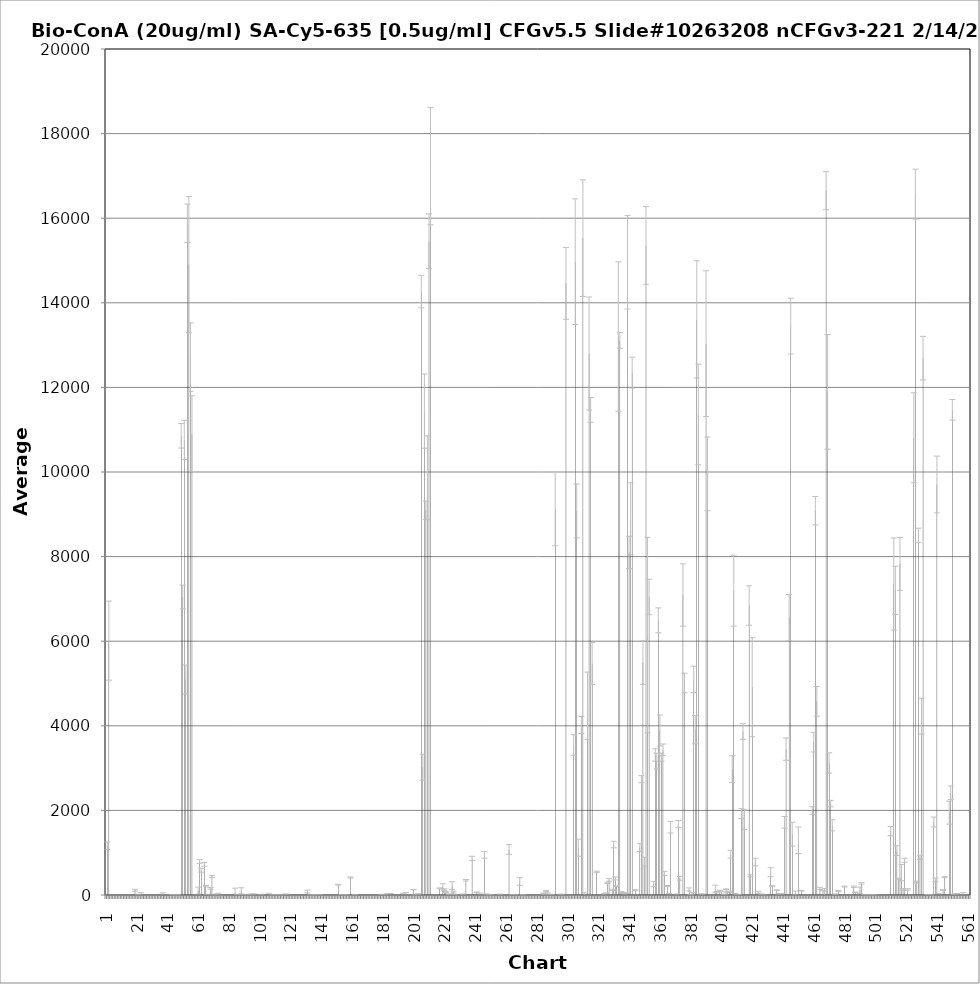
| Category | Average RFU |
|---|---|
| 1.0 | -9.25 |
| 2.0 | 1165 |
| 3.0 | 6013 |
| 4.0 | -28.25 |
| 5.0 | -6 |
| 6.0 | -19.5 |
| 7.0 | -5.5 |
| 8.0 | -15.75 |
| 9.0 | -4.5 |
| 10.0 | -16.5 |
| 11.0 | -10.25 |
| 12.0 | -10 |
| 13.0 | -50.75 |
| 14.0 | -29.5 |
| 15.0 | -39.5 |
| 16.0 | -67.5 |
| 17.0 | -46.5 |
| 18.0 | -33.5 |
| 19.0 | -15.5 |
| 20.0 | 110.25 |
| 21.0 | -17.25 |
| 22.0 | -3.5 |
| 23.0 | -33.5 |
| 24.0 | 20.75 |
| 25.0 | -8.75 |
| 26.0 | -29 |
| 27.0 | -6 |
| 28.0 | -24 |
| 29.0 | -8.5 |
| 30.0 | -19.75 |
| 31.0 | -7 |
| 32.0 | -10.25 |
| 33.0 | -9.75 |
| 34.0 | -10 |
| 35.0 | -9 |
| 36.0 | -11 |
| 37.0 | -46.5 |
| 38.0 | 4.75 |
| 39.0 | -52.25 |
| 40.0 | -44.25 |
| 41.0 | -39.75 |
| 42.0 | -19.5 |
| 43.0 | -25 |
| 44.0 | 0 |
| 45.0 | -19.25 |
| 46.0 | 3.75 |
| 47.0 | -22.25 |
| 48.0 | -0.5 |
| 49.0 | -12 |
| 50.0 | 10856 |
| 51.0 | 7046.75 |
| 52.0 | 10758.75 |
| 53.0 | 5094.25 |
| 54.0 | 15881 |
| 55.0 | 14902.5 |
| 56.0 | 12715 |
| 57.0 | 10904 |
| 58.0 | -3.5 |
| 59.0 | -9.25 |
| 60.0 | -47.25 |
| 61.0 | 103.75 |
| 62.0 | 793.25 |
| 63.0 | 584.25 |
| 64.0 | -22.5 |
| 65.0 | 724.5 |
| 66.0 | 210 |
| 67.0 | 14.5 |
| 68.0 | -22.75 |
| 69.0 | 157.25 |
| 70.0 | 438.25 |
| 71.0 | 2.75 |
| 72.0 | 9.75 |
| 73.0 | -19 |
| 74.0 | 19.75 |
| 75.0 | -17.5 |
| 76.0 | -7 |
| 77.0 | -16 |
| 78.0 | -8.75 |
| 79.0 | -17 |
| 80.0 | -14 |
| 81.0 | -11 |
| 82.0 | -4.75 |
| 83.0 | -3.25 |
| 84.0 | -79.25 |
| 85.0 | 59.25 |
| 86.0 | -39.5 |
| 87.0 | 10.75 |
| 88.0 | 1.25 |
| 89.0 | 98.25 |
| 90.0 | -26.75 |
| 91.0 | 10.75 |
| 92.0 | -25.75 |
| 93.0 | 5 |
| 94.0 | -16.75 |
| 95.0 | 14.75 |
| 96.0 | -3.25 |
| 97.0 | 24.25 |
| 98.0 | -7 |
| 99.0 | -10.5 |
| 100.0 | -17 |
| 101.0 | -39.5 |
| 102.0 | 15.25 |
| 103.0 | -20.25 |
| 104.0 | -6 |
| 105.0 | -17.5 |
| 106.0 | -6.75 |
| 107.0 | 20 |
| 108.0 | -14 |
| 109.0 | -2.5 |
| 110.0 | -14.75 |
| 111.0 | -121.5 |
| 112.0 | 7.5 |
| 113.0 | -10.5 |
| 114.0 | 8.75 |
| 115.0 | -36 |
| 116.0 | 8.5 |
| 117.0 | -28.75 |
| 118.0 | 19.5 |
| 119.0 | -9.75 |
| 120.0 | -5.5 |
| 121.0 | -6.75 |
| 122.0 | -5 |
| 123.0 | -21.75 |
| 124.0 | -59.5 |
| 125.0 | -17.75 |
| 126.0 | -30.5 |
| 127.0 | -7 |
| 128.0 | -20.75 |
| 129.0 | -9 |
| 130.0 | -19.5 |
| 131.0 | -12.5 |
| 132.0 | 81.5 |
| 133.0 | -13.5 |
| 134.0 | 1.5 |
| 135.0 | -7.5 |
| 136.0 | 3.25 |
| 137.0 | -44 |
| 138.0 | 7 |
| 139.0 | -29.25 |
| 140.0 | 2.5 |
| 141.0 | -14.75 |
| 142.0 | -5.25 |
| 143.0 | -9.25 |
| 144.0 | -6 |
| 145.0 | -10 |
| 146.0 | -22.5 |
| 147.0 | -7.25 |
| 148.0 | -27.75 |
| 149.0 | -7.25 |
| 150.0 | -16.75 |
| 151.0 | -3.5 |
| 152.0 | 243.5 |
| 153.0 | -10 |
| 154.0 | -3 |
| 155.0 | -18 |
| 156.0 | -51.5 |
| 157.0 | -26 |
| 158.0 | -35.25 |
| 159.0 | -37.25 |
| 160.0 | 413.25 |
| 161.0 | -21 |
| 162.0 | -14 |
| 163.0 | -10 |
| 164.0 | -12.25 |
| 165.0 | -7.5 |
| 166.0 | -6.75 |
| 167.0 | -6.75 |
| 168.0 | -9.25 |
| 169.0 | -24.25 |
| 170.0 | -6 |
| 171.0 | -19.5 |
| 172.0 | -6.25 |
| 173.0 | -14.75 |
| 174.0 | -4.75 |
| 175.0 | -12.5 |
| 176.0 | -15.5 |
| 177.0 | -5 |
| 178.0 | -18 |
| 179.0 | -30.75 |
| 180.0 | -11 |
| 181.0 | -31.75 |
| 182.0 | -26.75 |
| 183.0 | -29 |
| 184.0 | 2.5 |
| 185.0 | -31 |
| 186.0 | 12.5 |
| 187.0 | -25.75 |
| 188.0 | -9.5 |
| 189.0 | -5 |
| 190.0 | -9 |
| 191.0 | -8 |
| 192.0 | -8 |
| 193.0 | -10.75 |
| 194.0 | 14.25 |
| 195.0 | -7.75 |
| 196.0 | 18.25 |
| 197.0 | -7.5 |
| 198.0 | -21.75 |
| 199.0 | -16.75 |
| 200.0 | -25.75 |
| 201.0 | 128 |
| 202.0 | -3.75 |
| 203.0 | -9.75 |
| 204.0 | 23 |
| 205.0 | -14 |
| 206.0 | 14266 |
| 207.0 | 3019.5 |
| 208.0 | 11439 |
| 209.0 | 9096.5 |
| 210.0 | 9862.25 |
| 211.0 | 15454.75 |
| 212.0 | 17232 |
| 213.0 | -10.5 |
| 214.0 | -10.25 |
| 215.0 | -14.5 |
| 216.0 | -30.25 |
| 217.0 | -7.75 |
| 218.0 | 156.5 |
| 219.0 | -26.75 |
| 220.0 | 205.25 |
| 221.0 | 125 |
| 222.0 | 67.5 |
| 223.0 | -14.25 |
| 224.0 | 14 |
| 225.0 | -22.25 |
| 226.0 | 219.75 |
| 227.0 | 69 |
| 228.0 | 6.5 |
| 229.0 | -8 |
| 230.0 | -11.5 |
| 231.0 | -10 |
| 232.0 | -10.75 |
| 233.0 | 19 |
| 234.0 | -6.25 |
| 235.0 | 346.75 |
| 236.0 | -10.5 |
| 237.0 | -21.5 |
| 238.0 | -33.25 |
| 239.0 | 863.75 |
| 240.0 | -36.25 |
| 241.0 | -10 |
| 242.0 | 62.5 |
| 243.0 | -20.75 |
| 244.0 | 21.5 |
| 245.0 | -7.5 |
| 246.0 | -16.5 |
| 247.0 | 948.75 |
| 248.0 | 17 |
| 249.0 | -18 |
| 250.0 | 2.75 |
| 251.0 | 6.75 |
| 252.0 | -7.25 |
| 253.0 | -7 |
| 254.0 | -11 |
| 255.0 | -11.75 |
| 256.0 | -3.5 |
| 257.0 | 17 |
| 258.0 | -8 |
| 259.0 | -26.75 |
| 260.0 | -41.25 |
| 261.0 | -16.75 |
| 262.0 | -17.75 |
| 263.0 | 1076.25 |
| 264.0 | -15.75 |
| 265.0 | 4.25 |
| 266.0 | -11.5 |
| 267.0 | 5.75 |
| 268.0 | -14.5 |
| 269.0 | -122.5 |
| 270.0 | 317.75 |
| 271.0 | -19 |
| 272.0 | 3.25 |
| 273.0 | -3.5 |
| 274.0 | -17.5 |
| 275.0 | -7.5 |
| 276.0 | -13 |
| 277.0 | -8.5 |
| 278.0 | -9.75 |
| 279.0 | -4.5 |
| 280.0 | -8 |
| 281.0 | -9.5 |
| 282.0 | -4.5 |
| 283.0 | -8.75 |
| 284.0 | -5.75 |
| 285.0 | 23.25 |
| 286.0 | 22 |
| 287.0 | 94.75 |
| 288.0 | 33.75 |
| 289.0 | -25 |
| 290.0 | 12.75 |
| 291.0 | -23 |
| 292.0 | -11.5 |
| 293.0 | 9133.25 |
| 294.0 | -8.5 |
| 295.0 | -7.5 |
| 296.0 | -19 |
| 297.0 | 17 |
| 298.0 | -9.75 |
| 299.0 | -12.25 |
| 300.0 | 14459.25 |
| 301.0 | -5 |
| 302.0 | -9.75 |
| 303.0 | -11 |
| 304.0 | -5.25 |
| 305.0 | 3545.75 |
| 306.0 | 14971.5 |
| 307.0 | 9079.25 |
| 308.0 | 1118 |
| 309.0 | -17.75 |
| 310.0 | 4020.5 |
| 311.0 | 15529.5 |
| 312.0 | 24.75 |
| 313.0 | -10.25 |
| 314.0 | 4470.5 |
| 315.0 | 12801 |
| 316.0 | 11468.25 |
| 317.0 | 5475.25 |
| 318.0 | -17.5 |
| 319.0 | -21.75 |
| 320.0 | 546 |
| 321.0 | -6.5 |
| 322.0 | -8 |
| 323.0 | -6.75 |
| 324.0 | -4.25 |
| 325.0 | 26.75 |
| 326.0 | 43 |
| 327.0 | 279.5 |
| 328.0 | 355.5 |
| 329.0 | -19.25 |
| 330.0 | 121.25 |
| 331.0 | 1191.75 |
| 332.0 | 392.25 |
| 333.0 | 209 |
| 334.0 | 13201.25 |
| 335.0 | 13109 |
| 336.0 | 60.5 |
| 337.0 | 50.75 |
| 338.0 | 35.5 |
| 339.0 | 42.5 |
| 340.0 | 14959.25 |
| 341.0 | 8098 |
| 342.0 | 8896.75 |
| 343.0 | 12348.75 |
| 344.0 | -2 |
| 345.0 | 116.5 |
| 346.0 | -6.25 |
| 347.0 | -4.75 |
| 348.0 | 1121.25 |
| 349.0 | 2738 |
| 350.0 | 5493.75 |
| 351.0 | 787.5 |
| 352.0 | 15356.75 |
| 353.0 | 6144.5 |
| 354.0 | 7046.25 |
| 355.0 | -44 |
| 356.0 | -15 |
| 357.0 | 260 |
| 358.0 | 3310.25 |
| 359.0 | 3167.25 |
| 360.0 | 6492.75 |
| 361.0 | 3889.75 |
| 362.0 | 3259.25 |
| 363.0 | 3431.25 |
| 364.0 | 509.25 |
| 365.0 | -9.5 |
| 366.0 | 211.75 |
| 367.0 | 30.5 |
| 368.0 | 1603.25 |
| 369.0 | -12.75 |
| 370.0 | -12.25 |
| 371.0 | -7 |
| 372.0 | 10 |
| 373.0 | 1678.5 |
| 374.0 | 394 |
| 375.0 | -42.5 |
| 376.0 | 7092.25 |
| 377.0 | 5013.25 |
| 378.0 | -75.25 |
| 379.0 | -59.75 |
| 380.0 | 132 |
| 381.0 | -2.25 |
| 382.0 | 22 |
| 383.0 | 5096.75 |
| 384.0 | 3910.5 |
| 385.0 | 13607.75 |
| 386.0 | 11361 |
| 387.0 | -43.5 |
| 388.0 | 25.25 |
| 389.0 | -21.75 |
| 390.0 | -8.25 |
| 391.0 | 13033.5 |
| 392.0 | 9957 |
| 393.0 | -11 |
| 394.0 | -7.75 |
| 395.0 | -13.75 |
| 396.0 | -86.5 |
| 397.0 | 143.25 |
| 398.0 | 76 |
| 399.0 | -33.75 |
| 400.0 | 102 |
| 401.0 | 14 |
| 402.0 | -50.25 |
| 403.0 | -0.25 |
| 404.0 | 138.5 |
| 405.0 | 64.5 |
| 406.0 | 78.75 |
| 407.0 | 965.25 |
| 408.0 | 2976.75 |
| 409.0 | 7195.75 |
| 410.0 | 31.25 |
| 411.0 | -62.5 |
| 412.0 | 8.75 |
| 413.0 | -35.25 |
| 414.0 | 1922.25 |
| 415.0 | 3865 |
| 416.0 | 1782.75 |
| 417.0 | -21 |
| 418.0 | -1.5 |
| 419.0 | 6843.75 |
| 420.0 | 456.25 |
| 421.0 | 4910.5 |
| 422.0 | -141.25 |
| 423.0 | 777.25 |
| 424.0 | -45.25 |
| 425.0 | 63.5 |
| 426.0 | -34.75 |
| 427.0 | 20 |
| 428.0 | -76.5 |
| 429.0 | 0.25 |
| 430.0 | -59.75 |
| 431.0 | -56.5 |
| 432.0 | -45.75 |
| 433.0 | 538.75 |
| 434.0 | 209 |
| 435.0 | -68.75 |
| 436.0 | -7.5 |
| 437.0 | 116.5 |
| 438.0 | 26.75 |
| 439.0 | -26.25 |
| 440.0 | 30 |
| 441.0 | -25.5 |
| 442.0 | 1717.75 |
| 443.0 | 3448.25 |
| 444.0 | -94 |
| 445.0 | 6559.5 |
| 446.0 | 13448 |
| 447.0 | 1437.75 |
| 448.0 | -61.75 |
| 449.0 | 47 |
| 450.0 | -48.5 |
| 451.0 | 1293 |
| 452.0 | -33.25 |
| 453.0 | 98.5 |
| 454.0 | -30.25 |
| 455.0 | -31 |
| 456.0 | -10 |
| 457.0 | -8 |
| 458.0 | -5.5 |
| 459.0 | -15 |
| 460.0 | 1997.5 |
| 461.0 | 3611.5 |
| 462.0 | 9085 |
| 463.0 | 4577.5 |
| 464.0 | -26.25 |
| 465.0 | 154.75 |
| 466.0 | -34 |
| 467.0 | 100.75 |
| 468.0 | 66.5 |
| 469.0 | 16651.5 |
| 470.0 | 11896.25 |
| 471.0 | 3120.75 |
| 472.0 | 2161.5 |
| 473.0 | 1647 |
| 474.0 | -70.25 |
| 475.0 | 20 |
| 476.0 | -55.25 |
| 477.0 | 95.5 |
| 478.0 | -8.5 |
| 479.0 | -11.75 |
| 480.0 | -9 |
| 481.0 | 200 |
| 482.0 | -43.5 |
| 483.0 | -109.5 |
| 484.0 | -23.25 |
| 485.0 | -88.25 |
| 486.0 | -12.5 |
| 487.0 | 195.75 |
| 488.0 | 66.25 |
| 489.0 | -41.25 |
| 490.0 | -40 |
| 491.0 | 113.75 |
| 492.0 | 278.5 |
| 493.0 | -199.75 |
| 494.0 | 7 |
| 495.0 | -109.5 |
| 496.0 | 2 |
| 497.0 | -110 |
| 498.0 | 3 |
| 499.0 | -85 |
| 500.0 | -33 |
| 501.0 | -16 |
| 502.0 | -23 |
| 503.0 | -14.25 |
| 504.0 | -16.75 |
| 505.0 | -19.25 |
| 506.0 | -40.75 |
| 507.0 | -8 |
| 508.0 | -59.5 |
| 509.0 | -7 |
| 510.0 | -26.25 |
| 511.0 | 1508.75 |
| 512.0 | -24.5 |
| 513.0 | 7352.75 |
| 514.0 | 7203 |
| 515.0 | 1049.25 |
| 516.0 | 381.25 |
| 517.0 | 7828.25 |
| 518.0 | 528.75 |
| 519.0 | 135.75 |
| 520.0 | 822 |
| 521.0 | -47.5 |
| 522.0 | 132.5 |
| 523.0 | -11 |
| 524.0 | -15 |
| 525.0 | -10.25 |
| 526.0 | 10810.25 |
| 527.0 | 16569 |
| 528.0 | 305 |
| 529.0 | 8504 |
| 530.0 | 892 |
| 531.0 | 4230 |
| 532.0 | 12691.5 |
| 533.0 | -52 |
| 534.0 | -93 |
| 535.0 | -39 |
| 536.0 | -40.5 |
| 537.0 | -23.75 |
| 538.0 | -63.5 |
| 539.0 | 1725.5 |
| 540.0 | 356.75 |
| 541.0 | 9703.75 |
| 542.0 | 31.75 |
| 543.0 | -23.25 |
| 544.0 | -9.75 |
| 545.0 | 114.75 |
| 546.0 | 422 |
| 547.0 | -46.25 |
| 548.0 | -25.5 |
| 549.0 | 1948.25 |
| 550.0 | 2417 |
| 551.0 | 11470 |
| 552.0 | 15 |
| 553.0 | 24.5 |
| 554.0 | 31.75 |
| 555.0 | -10.5 |
| 556.0 | -14.25 |
| 557.0 | -11.25 |
| 558.0 | 19 |
| 559.0 | -43.25 |
| 560.0 | -53.75 |
| 561.0 | -17.25 |
| 562.0 | -16.75 |